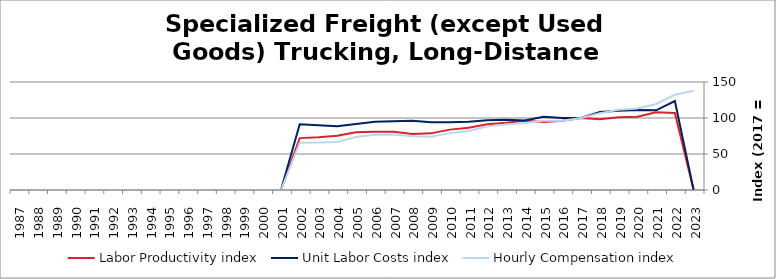
| Category | Labor Productivity index | Unit Labor Costs index | Hourly Compensation index |
|---|---|---|---|
| 2023.0 | 0 | 0 | 137.926 |
| 2022.0 | 106.982 | 123.628 | 132.26 |
| 2021.0 | 108.024 | 110.631 | 119.508 |
| 2020.0 | 101.802 | 111.186 | 113.19 |
| 2019.0 | 101.206 | 110.129 | 111.457 |
| 2018.0 | 98.421 | 108.301 | 106.591 |
| 2017.0 | 100 | 100 | 100 |
| 2016.0 | 96.194 | 99.843 | 96.043 |
| 2015.0 | 94.604 | 101.731 | 96.242 |
| 2014.0 | 96.329 | 96.517 | 92.974 |
| 2013.0 | 93.372 | 97.399 | 90.943 |
| 2012.0 | 91.251 | 96.851 | 88.378 |
| 2011.0 | 86.356 | 94.96 | 82.003 |
| 2010.0 | 83.855 | 94.19 | 78.984 |
| 2009.0 | 78.671 | 94.066 | 74.003 |
| 2008.0 | 77.776 | 96.032 | 74.69 |
| 2007.0 | 80.926 | 95.356 | 77.168 |
| 2006.0 | 81.007 | 94.817 | 76.808 |
| 2005.0 | 80.199 | 91.771 | 73.6 |
| 2004.0 | 75.288 | 88.464 | 66.603 |
| 2003.0 | 73.21 | 89.933 | 65.84 |
| 2002.0 | 72.077 | 91.262 | 65.779 |
| 2001.0 | 0 | 0 | 0 |
| 2000.0 | 0 | 0 | 0 |
| 1999.0 | 0 | 0 | 0 |
| 1998.0 | 0 | 0 | 0 |
| 1997.0 | 0 | 0 | 0 |
| 1996.0 | 0 | 0 | 0 |
| 1995.0 | 0 | 0 | 0 |
| 1994.0 | 0 | 0 | 0 |
| 1993.0 | 0 | 0 | 0 |
| 1992.0 | 0 | 0 | 0 |
| 1991.0 | 0 | 0 | 0 |
| 1990.0 | 0 | 0 | 0 |
| 1989.0 | 0 | 0 | 0 |
| 1988.0 | 0 | 0 | 0 |
| 1987.0 | 0 | 0 | 0 |